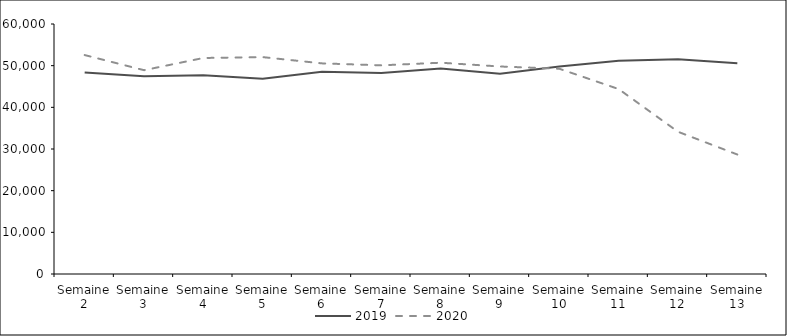
| Category | 2019 | 2020 |
|---|---|---|
| 0 | 48385 | 52546 |
| 1 | 47440 | 48916 |
| 2 | 47686 | 51844 |
| 3 | 46872 | 52053 |
| 4 | 48559 | 50551 |
| 5 | 48236 | 50079 |
| 6 | 49293 | 50708 |
| 7 | 48075 | 49804 |
| 8 | 49809 | 49263 |
| 9 | 51195 | 44385 |
| 10 | 51559 | 34136 |
| 11 | 50608 | 28677 |